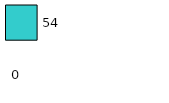
| Category | Series 0 | Series 1 |
|---|---|---|
| 0 | 0 | 54 |